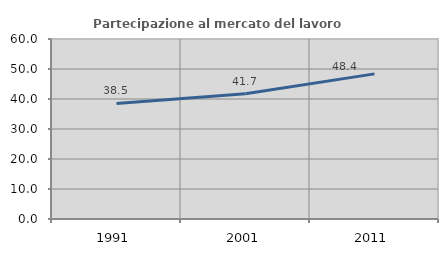
| Category | Partecipazione al mercato del lavoro  femminile |
|---|---|
| 1991.0 | 38.534 |
| 2001.0 | 41.744 |
| 2011.0 | 48.373 |